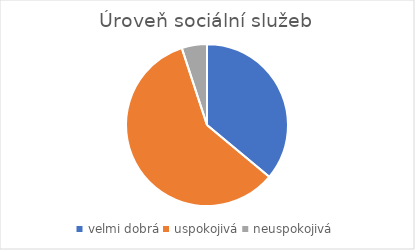
| Category | Úroveň sociální služeb |
|---|---|
| velmi dobrá | 93 |
| uspokojivá | 152 |
| neuspokojivá | 13 |